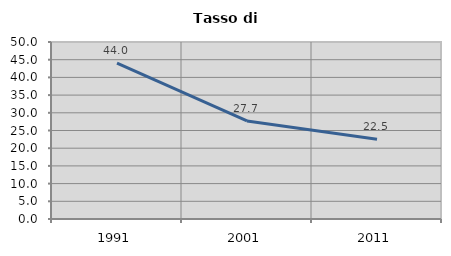
| Category | Tasso di disoccupazione   |
|---|---|
| 1991.0 | 44.027 |
| 2001.0 | 27.685 |
| 2011.0 | 22.513 |